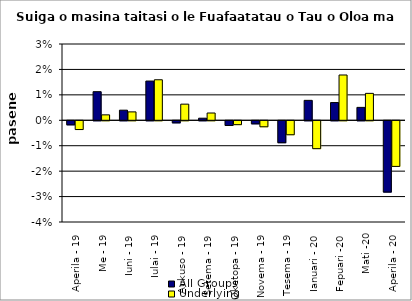
| Category | All Groups | Underlying |
|---|---|---|
| Aperila - 19 | -0.002 | -0.003 |
| Me - 19 | 0.011 | 0.002 |
| Iuni - 19 | 0.004 | 0.003 |
| Iulai - 19 | 0.015 | 0.016 |
| Aukuso - 19 | -0.001 | 0.006 |
| Setema - 19 | 0.001 | 0.003 |
| Oketopa - 19 | -0.002 | -0.002 |
| Novema - 19 | -0.001 | -0.002 |
| Tesema - 19 | -0.009 | -0.005 |
| Ianuari - 20 | 0.008 | -0.011 |
| Fepuari -20 | 0.007 | 0.018 |
| Mati -20 | 0.005 | 0.011 |
| Aperila - 20 | -0.028 | -0.018 |